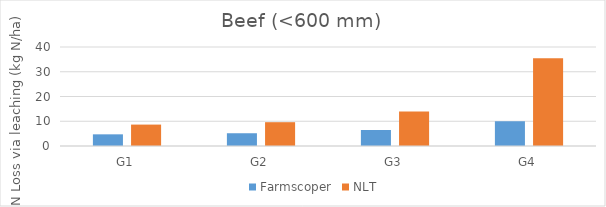
| Category | Farmscoper | NLT |
|---|---|---|
| G1 | 4.713 | 8.65 |
| G2 | 5.154 | 9.62 |
| G3 | 6.477 | 13.9 |
| G4 | 10.004 | 35.44 |